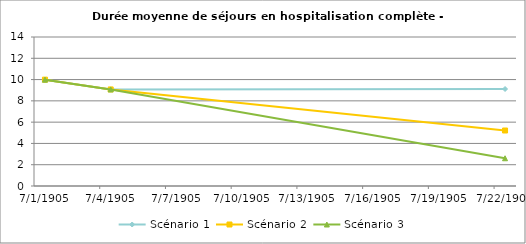
| Category | Scénario 1 | Scénario 2 | Scénario 3 |
|---|---|---|---|
| 2009.0 | 9.993 | 9.993 | 9.993 |
| 2012.0 | 9.072 | 9.072 | 9.072 |
| 2030.0 | 9.114 | 5.214 | 2.607 |